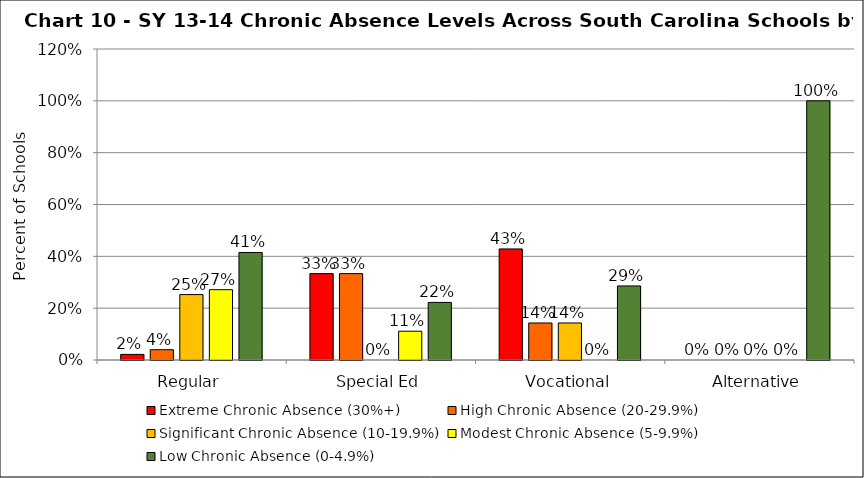
| Category | Extreme Chronic Absence (30%+) | High Chronic Absence (20-29.9%) | Significant Chronic Absence (10-19.9%) | Modest Chronic Absence (5-9.9%) | Low Chronic Absence (0-4.9%) |
|---|---|---|---|---|---|
| 0 | 0.022 | 0.04 | 0.252 | 0.271 | 0.415 |
| 1 | 0.333 | 0.333 | 0 | 0.111 | 0.222 |
| 2 | 0.429 | 0.143 | 0.143 | 0 | 0.286 |
| 3 | 0 | 0 | 0 | 0 | 1 |